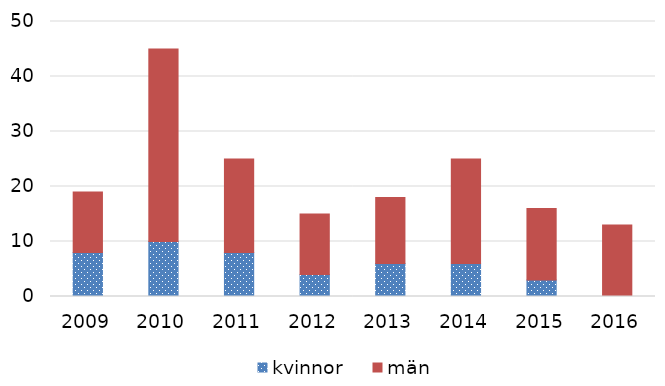
| Category | kvinnor | män |
|---|---|---|
| 2009 | 8 | 11 |
| 2010 | 10 | 35 |
| 2011 | 8 | 17 |
| 2012 | 4 | 11 |
| 2013 | 6 | 12 |
| 2014 | 6 | 19 |
| 2015 | 3 | 13 |
| 2016 | 0 | 13 |